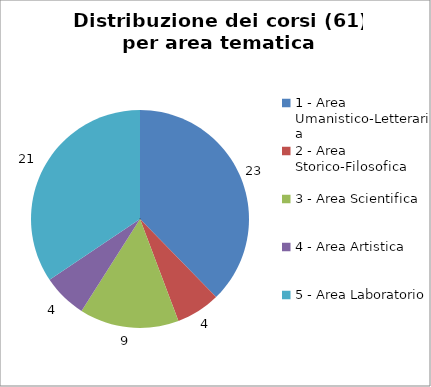
| Category | Nr. Corsi |
|---|---|
| 1 - Area Umanistico-Letteraria | 23 |
| 2 - Area Storico-Filosofica | 4 |
| 3 - Area Scientifica | 9 |
| 4 - Area Artistica | 4 |
| 5 - Area Laboratorio | 21 |